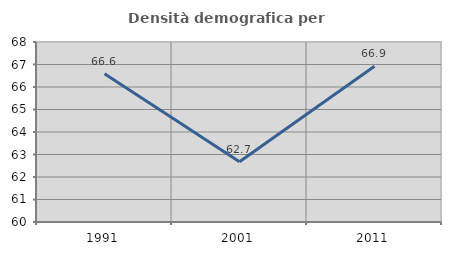
| Category | Densità demografica |
|---|---|
| 1991.0 | 66.592 |
| 2001.0 | 62.674 |
| 2011.0 | 66.918 |